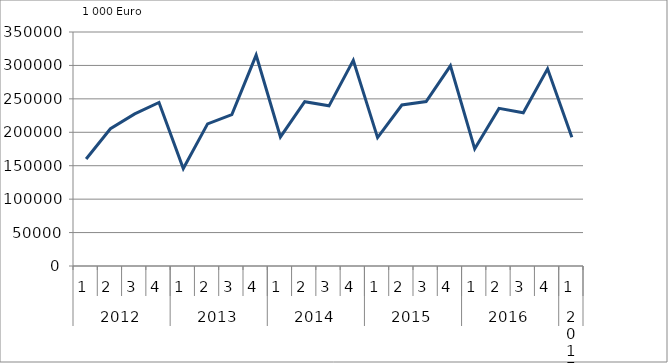
| Category | Ausbaugewerblicher Umsatz3 |
|---|---|
| 0 | 160065 |
| 1 | 205323 |
| 2 | 227469 |
| 3 | 244537 |
| 4 | 145792.596 |
| 5 | 212577 |
| 6 | 226327.748 |
| 7 | 315433.896 |
| 8 | 193004.858 |
| 9 | 245754.159 |
| 10 | 239547.85 |
| 11 | 307688.935 |
| 12 | 192043.756 |
| 13 | 240826.879 |
| 14 | 245916.087 |
| 15 | 299455.378 |
| 16 | 175225.59 |
| 17 | 235781.631 |
| 18 | 229227.559 |
| 19 | 294992.157 |
| 20 | 192499.539 |